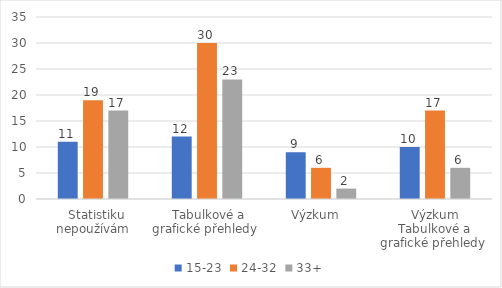
| Category | 15-23 | 24-32 | 33+ |
|---|---|---|---|
|   Statistiku nepoužívám | 11 | 19 | 17 |
|  Tabulkové a grafické přehledy  | 12 | 30 | 23 |
| Výzkum   | 9 | 6 | 2 |
| Výzkum Tabulkové a grafické přehledy  | 10 | 17 | 6 |